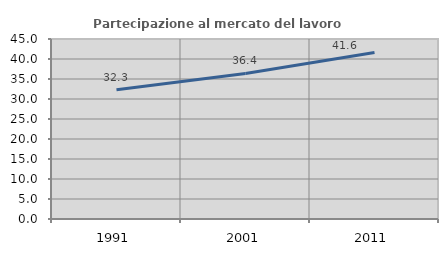
| Category | Partecipazione al mercato del lavoro  femminile |
|---|---|
| 1991.0 | 32.3 |
| 2001.0 | 36.383 |
| 2011.0 | 41.617 |